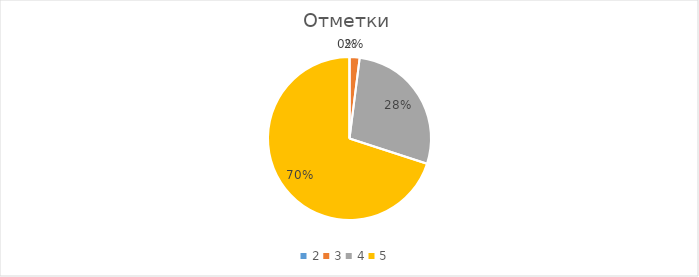
| Category | Series 0 |
|---|---|
| 2.0 | 0 |
| 3.0 | 0.02 |
| 4.0 | 0.28 |
| 5.0 | 0.7 |